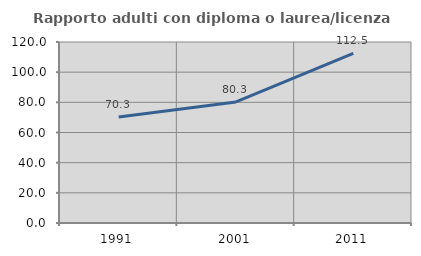
| Category | Rapporto adulti con diploma o laurea/licenza media  |
|---|---|
| 1991.0 | 70.306 |
| 2001.0 | 80.254 |
| 2011.0 | 112.492 |